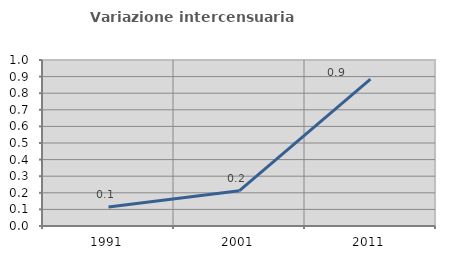
| Category | Variazione intercensuaria annua |
|---|---|
| 1991.0 | 0.114 |
| 2001.0 | 0.213 |
| 2011.0 | 0.885 |